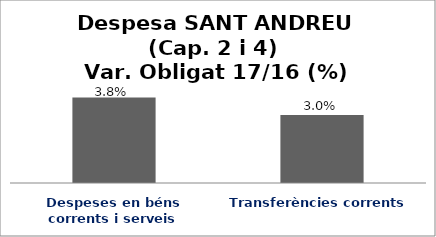
| Category | Series 0 |
|---|---|
| Despeses en béns corrents i serveis | 0.038 |
| Transferències corrents | 0.03 |